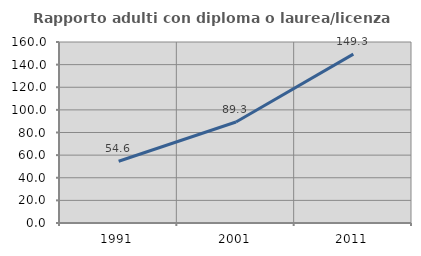
| Category | Rapporto adulti con diploma o laurea/licenza media  |
|---|---|
| 1991.0 | 54.567 |
| 2001.0 | 89.251 |
| 2011.0 | 149.284 |